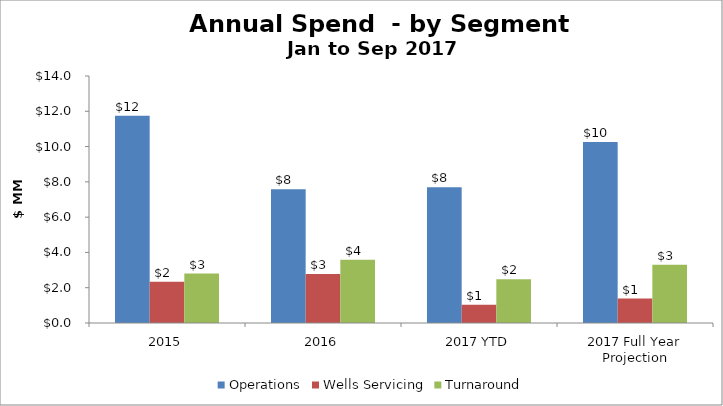
| Category | Operations | Wells Servicing | Turnaround |
|---|---|---|---|
| 2015 | 11747566 | 2342418 | 2801087 |
| 2016 | 7578731 | 2780334 | 3586352 |
| 2017 YTD | 7698190 | 1040276 | 2475114 |
| 2017 Full Year Projection | 10264253.333 | 1387034.667 | 3300152 |